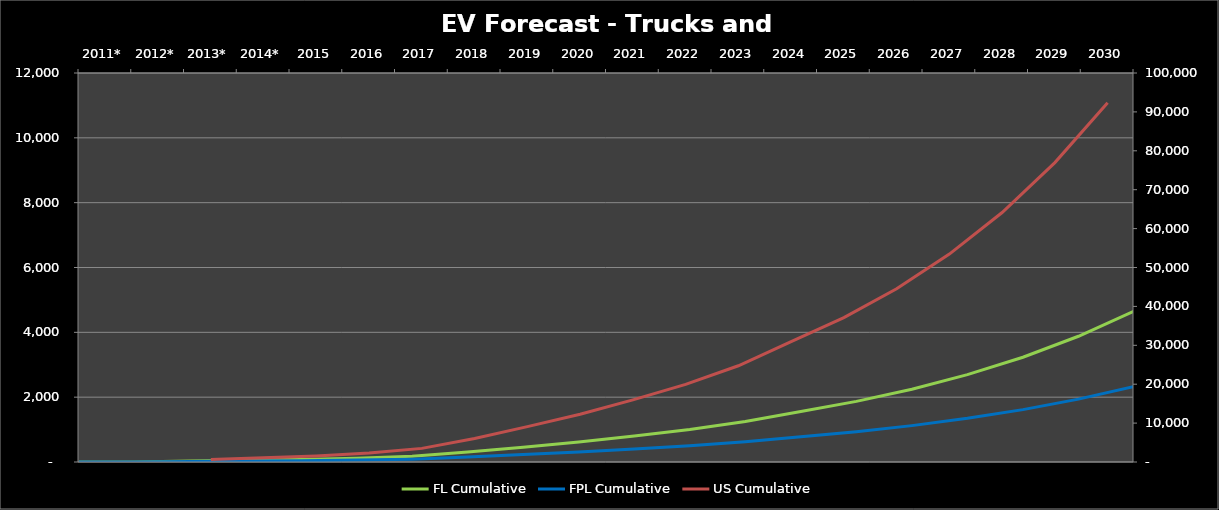
| Category | FL Cumulative | FPL Cumulative |
|---|---|---|
| 0 | 0 | 0 |
| 1 | 0 | 0 |
| 2 | 34.295 | 17 |
| 3 | 55.784 | 28 |
| 4 | 77.969 | 39 |
| 5 | 115.265 | 58 |
| 6 | 176.4 | 88 |
| 7 | 305.626 | 153 |
| 8 | 458.438 | 229 |
| 9 | 618.912 | 309 |
| 10 | 804.586 | 402 |
| 11 | 1005.732 | 503 |
| 12 | 1247.098 | 624 |
| 13 | 1558.872 | 779 |
| 14 | 1870.646 | 935 |
| 15 | 2244.766 | 1122 |
| 16 | 2693.729 | 1347 |
| 17 | 3232.454 | 1616 |
| 18 | 3878.935 | 1939 |
| 19 | 4654.742 | 2327 |